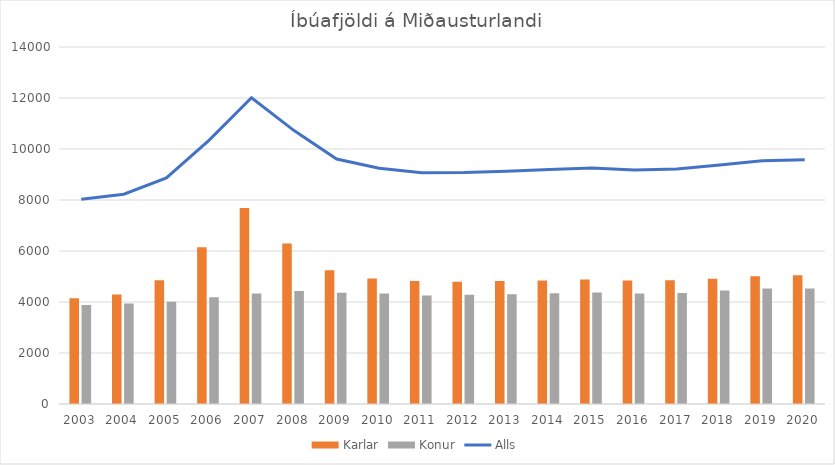
| Category | Karlar | Konur |
|---|---|---|
| 2003.0 | 4149 | 3879 |
| 2004.0 | 4290 | 3938 |
| 2005.0 | 4856 | 4009 |
| 2006.0 | 6149 | 4187 |
| 2007.0 | 7682 | 4330 |
| 2008.0 | 6293 | 4430 |
| 2009.0 | 5244 | 4365 |
| 2010.0 | 4918 | 4329 |
| 2011.0 | 4819 | 4253 |
| 2012.0 | 4796 | 4286 |
| 2013.0 | 4825 | 4304 |
| 2014.0 | 4848 | 4344 |
| 2015.0 | 4879 | 4371 |
| 2016.0 | 4841 | 4334 |
| 2017.0 | 4857 | 4356 |
| 2018.0 | 4915 | 4454 |
| 2019.0 | 5010 | 4528 |
| 2020.0 | 5049 | 4530 |